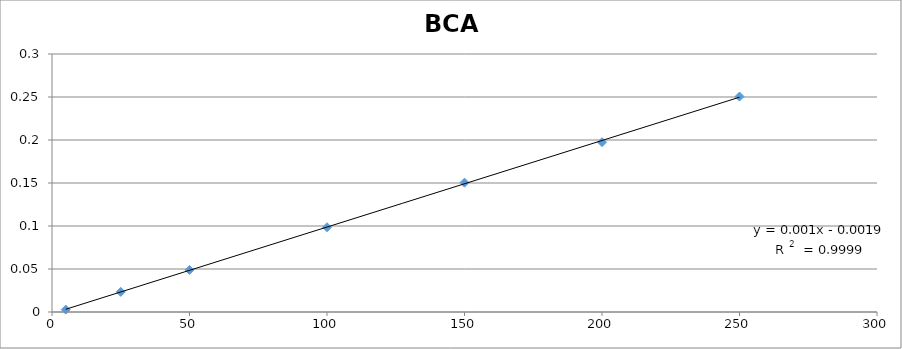
| Category | BCA |
|---|---|
| 250.0 | 0.251 |
| 200.0 | 0.197 |
| 150.0 | 0.15 |
| 100.0 | 0.099 |
| 50.0 | 0.049 |
| 25.0 | 0.023 |
| 5.0 | 0.003 |